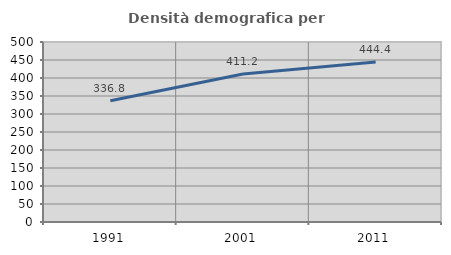
| Category | Densità demografica |
|---|---|
| 1991.0 | 336.792 |
| 2001.0 | 411.23 |
| 2011.0 | 444.371 |